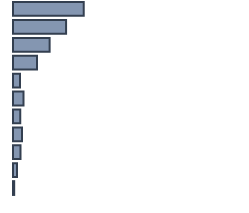
| Category | Percentatge |
|---|---|
| 0 | 30.616 |
| 1 | 22.978 |
| 2 | 15.854 |
| 3 | 10.398 |
| 4 | 3.081 |
| 5 | 4.557 |
| 6 | 3.145 |
| 7 | 3.915 |
| 8 | 3.209 |
| 9 | 1.733 |
| 10 | 0.513 |